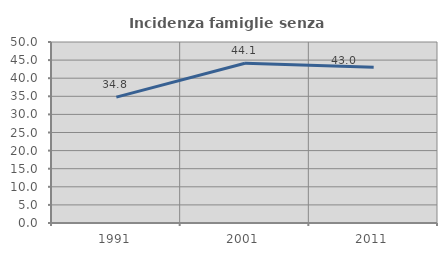
| Category | Incidenza famiglie senza nuclei |
|---|---|
| 1991.0 | 34.783 |
| 2001.0 | 44.144 |
| 2011.0 | 43 |